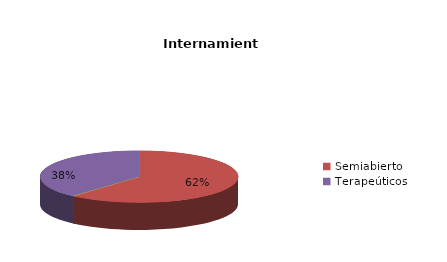
| Category | Series 0 |
|---|---|
| Cerrado | 0 |
| Semiabierto | 8 |
| Abierto | 0 |
| Terapeúticos | 5 |